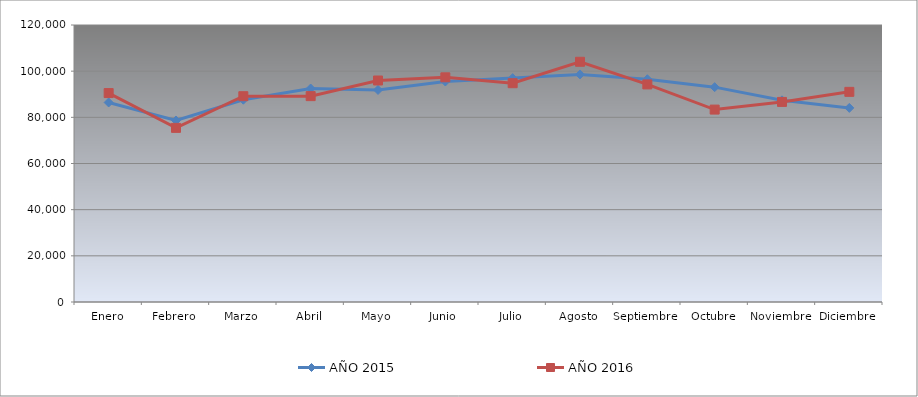
| Category | AÑO 2015 | AÑO 2016 |
|---|---|---|
| Enero | 86433.078 | 90514.539 |
| Febrero | 78633.68 | 75433.906 |
| Marzo | 87633.537 | 89159.783 |
| Abril | 92487.658 | 89182.328 |
| Mayo | 91856.161 | 95962.259 |
| Junio | 95513.923 | 97333.412 |
| Julio | 96990.15 | 94783.764 |
| Agosto | 98579.144 | 104068.253 |
| Septiembre | 96512.426 | 94259.078 |
| Octubre | 93076.098 | 83359.539 |
| Noviembre | 87379.298 | 86680.845 |
| Diciembre | 84087.518 | 91039.225 |